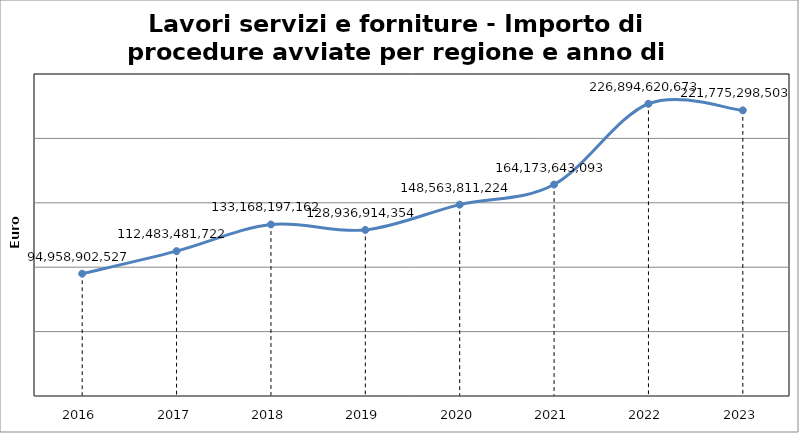
| Category | Series 0 |
|---|---|
| 2016.0 | 94958902527 |
| 2017.0 | 112483481722 |
| 2018.0 | 133168197162 |
| 2019.0 | 128936914354 |
| 2020.0 | 148563811224 |
| 2021.0 | 164173643093 |
| 2022.0 | 226894620673 |
| 2023.0 | 221775298503 |